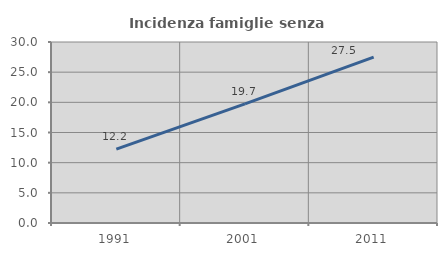
| Category | Incidenza famiglie senza nuclei |
|---|---|
| 1991.0 | 12.241 |
| 2001.0 | 19.749 |
| 2011.0 | 27.479 |